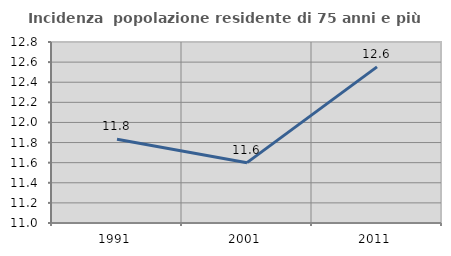
| Category | Incidenza  popolazione residente di 75 anni e più |
|---|---|
| 1991.0 | 11.832 |
| 2001.0 | 11.6 |
| 2011.0 | 12.552 |